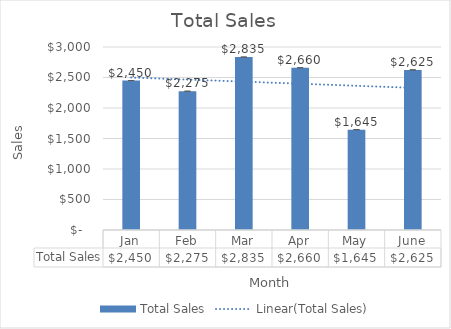
| Category | Total Sales |
|---|---|
| Jan | 2450 |
| Feb | 2275 |
| Mar | 2835 |
| Apr | 2660 |
| May | 1645 |
| June | 2625 |